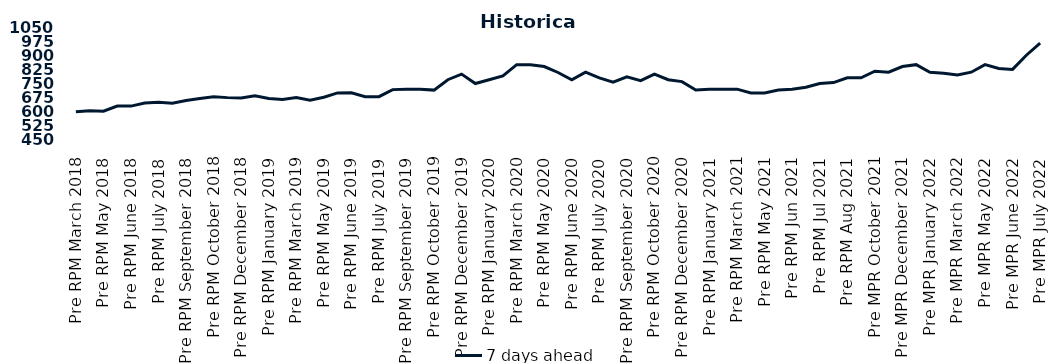
| Category | 7 days ahead |
|---|---|
| Pre RPM March 2018 | 600 |
| Post RPM March 2018 | 605 |
| Pre RPM May 2018 | 603 |
| Post RPM May 2018 | 630 |
| Pre RPM June 2018 | 630 |
| Post RPM June 2018 | 646.5 |
| Pre RPM July 2018 | 650 |
| Post RPM July 2018 | 645 |
| Pre RPM September 2018 | 660 |
| Post RPM September 2018 | 670 |
| Pre RPM October 2018 | 680 |
| Post RPM October 2018 | 675 |
| Pre RPM December 2018 | 672.5 |
| Post RPM December 2018 | 685 |
| Pre RPM January 2019 | 670 |
| Post RPM January 2019 | 665 |
| Pre RPM March 2019 | 675 |
| Post RPM March 2019 | 661 |
| Pre RPM May 2019 | 677 |
| Post RPM May 2019 | 700 |
| Pre RPM June 2019 | 700.5 |
| Post RPM June 2019 | 680 |
| Pre RPM July 2019 | 680 |
| Post RPM July 2019 | 717.5 |
| Pre RPM September 2019 | 720 |
| Post RPM September 2019 | 720 |
| Pre RPM October 2019 | 715 |
| Post RPM October 2019 | 770 |
| Pre RPM December 2019 | 800 |
| Post RPM December 2019 | 750 |
| Pre RPM January 2020 | 770 |
| Post RPM January 2020 | 790 |
| Pre RPM March 2020 | 850 |
| Post RPM March 2020 | 850 |
| Pre RPM May 2020 | 840 |
| Post RPM May 2020 | 808.5 |
| Pre RPM June 2020 | 770 |
| Post RPM June 2020 | 810 |
| Pre RPM July 2020 | 780 |
| Post RPM July 2020 | 757 |
| Pre RPM September 2020 | 785 |
| Post RPM September 2020 | 765 |
| Pre RPM October 2020 | 800 |
| Post RPM October 2020 | 770 |
| Pre RPM December 2020 | 760 |
|  Post RPM December 2020 | 715 |
| Pre RPM January 2021 | 720 |
| Post RPM January 2021 | 720 |
|  Pre RPM March 2021 | 720 |
|  Post RPM March 2021 | 700 |
|  Pre RPM May 2021 | 700 |
|  Post RPM May 2021 | 715 |
|  Pre RPM Jun 2021 | 720 |
|   Post RPM Jun 2021 | 730 |
| Pre RPM Jul 2021 | 750 |
|  Post RPM Jul 2021 | 755 |
| Pre RPM Aug 2021 | 780 |
|  Post RPM Aug 2021 | 780 |
| Pre MPR October 2021 | 815 |
| Post MPR October 2021 | 810 |
| Pre MPR December 2021 | 840 |
| Post MPR December 2021 | 850 |
| Pre MPR January 2022 | 810 |
| Post MPR January 2022 | 805 |
| Pre MPR March 2022 | 795 |
| Post MPR March 2022 | 810 |
| Pre MPR May 2022 | 850 |
| Post MPR May 2022 | 830 |
| Pre MPR June 2022 | 825 |
| Post MPR June 2022 | 900 |
| Pre MPR July 2022 | 965 |